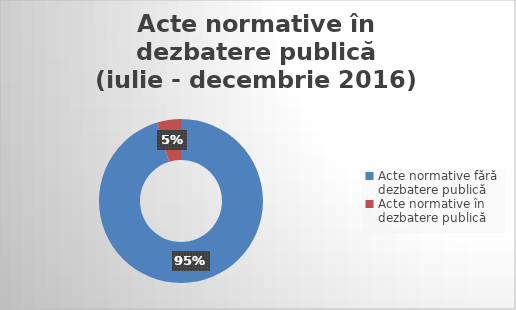
| Category | Series 0 |
|---|---|
| Acte normative fără dezbatere publică | 142 |
| Acte normative în dezbatere publică | 7 |